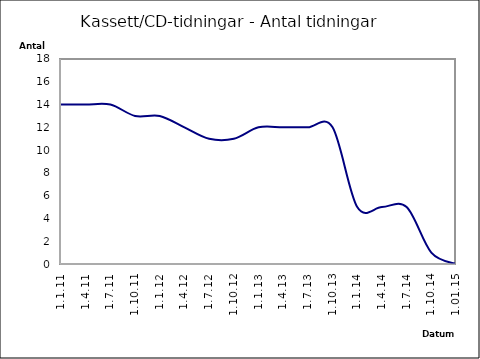
| Category | Series 0 |
|---|---|
| 1.1.11 | 14 |
| 1.4.11 | 14 |
| 1.7.11 | 14 |
| 1.10.11 | 13 |
| 1.1.12 | 13 |
| 1.4.12 | 12 |
| 1.7.12 | 11 |
| 1.10.12 | 11 |
| 1.1.13 | 12 |
| 1.4.13 | 12 |
| 1.7.13 | 12 |
| 1.10.13 | 12 |
| 1.1.14 | 5 |
| 1.4.14 | 5 |
| 1.7.14 | 5 |
| 1.10.14 | 1 |
| 1.01.15 | 0 |